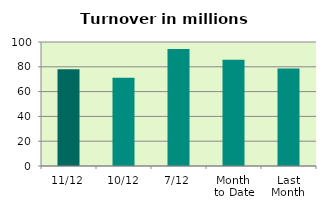
| Category | Series 0 |
|---|---|
| 11/12 | 77.934 |
| 10/12 | 71.26 |
| 7/12 | 94.364 |
| Month 
to Date | 85.674 |
| Last
Month | 78.658 |